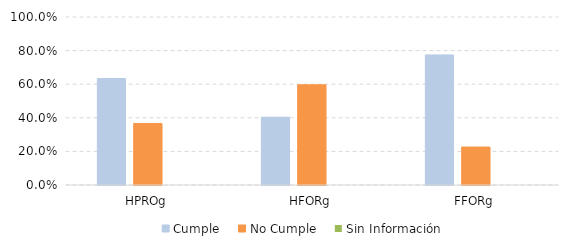
| Category | Cumple | No Cumple | Sin Información |
|---|---|---|---|
| HPROg | 0.634 | 0.366 | 0 |
| HFORg | 0.404 | 0.596 | 0 |
| FFORg | 0.774 | 0.226 | 0 |